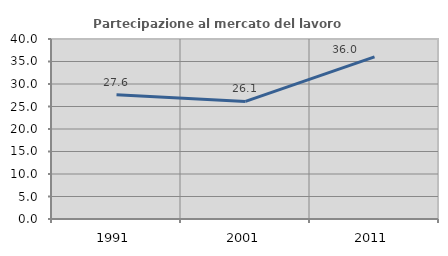
| Category | Partecipazione al mercato del lavoro  femminile |
|---|---|
| 1991.0 | 27.612 |
| 2001.0 | 26.126 |
| 2011.0 | 36.036 |